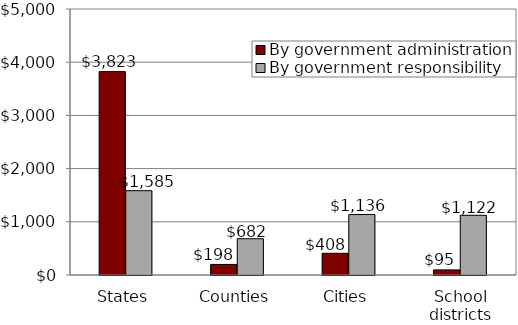
| Category | By government administration | By government responsibility |
|---|---|---|
| States | 3822923471.613 | 1584543166.198 |
| Counties | 198312145.579 | 681710061.813 |
| Cities | 407892789.218 | 1136045397.166 |
| School districts | 95344556.488 | 1122174337.722 |